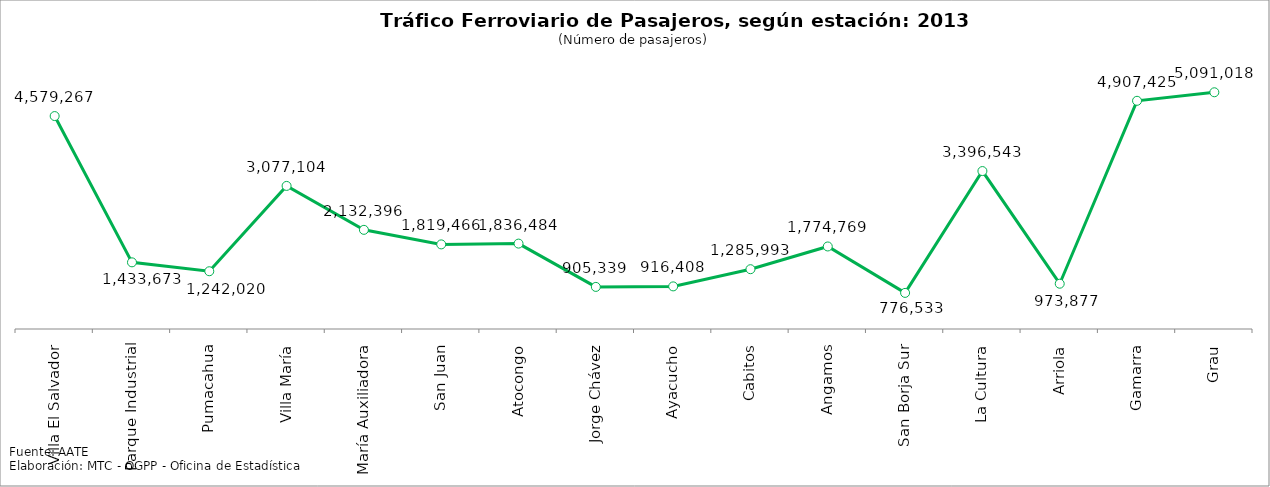
| Category | Series 0 |
|---|---|
| Villa El Salvador | 4579267 |
| Parque Industrial | 1433673 |
| Pumacahua | 1242020 |
| Villa María | 3077104 |
| María Auxiliadora | 2132396 |
| San Juan | 1819466 |
| Atocongo | 1836484 |
| Jorge Chávez | 905339 |
| Ayacucho | 916408 |
| Cabitos | 1285993 |
| Angamos | 1774769 |
| San Borja Sur | 776533 |
| La Cultura | 3396543 |
| Arriola | 973877 |
| Gamarra | 4907425 |
| Grau | 5091018 |